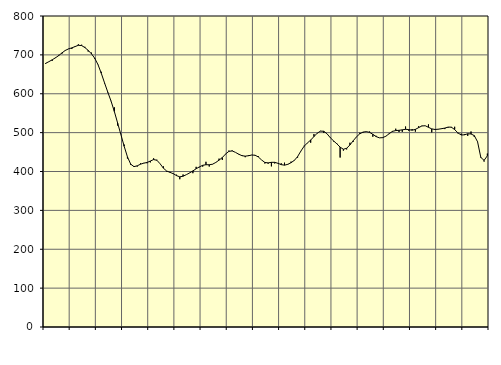
| Category | Piggar | Series 1 |
|---|---|---|
| nan | 676.5 | 678.28 |
| 87.0 | 682.6 | 682.55 |
| 87.0 | 684.5 | 687.34 |
| 87.0 | 693.2 | 692.38 |
| nan | 700 | 698.29 |
| 88.0 | 703.2 | 705.12 |
| 88.0 | 712.2 | 711.39 |
| 88.0 | 715.8 | 715.38 |
| nan | 715.1 | 718.01 |
| 89.0 | 720.4 | 721.36 |
| 89.0 | 727.2 | 724.63 |
| 89.0 | 726.1 | 723.93 |
| nan | 720.7 | 718.84 |
| 90.0 | 708.6 | 711.55 |
| 90.0 | 705.8 | 702.76 |
| 90.0 | 689.7 | 691.4 |
| nan | 674.4 | 674.96 |
| 91.0 | 656.5 | 652.93 |
| 91.0 | 626.8 | 627.99 |
| 91.0 | 602.9 | 604.09 |
| nan | 581.6 | 580.92 |
| 92.0 | 565.1 | 554.32 |
| 92.0 | 518.2 | 524.76 |
| 92.0 | 495.4 | 494.89 |
| nan | 469.2 | 464.93 |
| 93.0 | 433.4 | 437.69 |
| 93.0 | 417 | 418.87 |
| 93.0 | 413.9 | 412.54 |
| nan | 412.8 | 414.64 |
| 94.0 | 421 | 418.78 |
| 94.0 | 422.1 | 421.48 |
| 94.0 | 421.3 | 423.17 |
| nan | 423.4 | 426.89 |
| 95.0 | 434 | 430.69 |
| 95.0 | 430.2 | 428.92 |
| 95.0 | 419.7 | 419.66 |
| nan | 413.2 | 408.42 |
| 96.0 | 399.6 | 401.2 |
| 96.0 | 399.1 | 397.86 |
| 96.0 | 395.3 | 394.38 |
| nan | 391.8 | 389.39 |
| 97.0 | 380.1 | 386.26 |
| 97.0 | 392.3 | 387.85 |
| 97.0 | 391.9 | 391.85 |
| nan | 396.7 | 396.26 |
| 98.0 | 395.6 | 401.49 |
| 98.0 | 412 | 407.04 |
| 98.0 | 410.9 | 411.87 |
| nan | 412.5 | 415.94 |
| 99.0 | 425 | 417.44 |
| 99.0 | 412.8 | 417.34 |
| 99.0 | 418.3 | 418.71 |
| nan | 423.7 | 423.25 |
| 0.0 | 433.1 | 429.2 |
| 0.0 | 429.7 | 435.94 |
| 0.0 | 445.4 | 444.9 |
| nan | 453.8 | 451.82 |
| 1.0 | 454.3 | 452.9 |
| 1.0 | 449.3 | 449.28 |
| 1.0 | 445.2 | 444.47 |
| nan | 442.4 | 440.71 |
| 2.0 | 436.8 | 439.48 |
| 2.0 | 442 | 440.57 |
| 2.0 | 442.7 | 442.35 |
| nan | 441 | 441.94 |
| 3.0 | 439.3 | 437.41 |
| 3.0 | 429.6 | 429.63 |
| 3.0 | 420.5 | 423.29 |
| nan | 420 | 422.21 |
| 4.0 | 413.2 | 423.62 |
| 4.0 | 420.7 | 423.6 |
| 4.0 | 421.7 | 421.1 |
| nan | 421.1 | 417.67 |
| 5.0 | 422.7 | 416.27 |
| 5.0 | 419.3 | 418.42 |
| 5.0 | 425.4 | 422.7 |
| nan | 427.7 | 428.56 |
| 6.0 | 435.7 | 438.34 |
| 6.0 | 452.7 | 452.38 |
| 6.0 | 466.3 | 465.09 |
| nan | 472.8 | 473.36 |
| 7.0 | 474.1 | 480.87 |
| 7.0 | 496.2 | 489.81 |
| 7.0 | 498 | 498.53 |
| nan | 504.5 | 503.89 |
| 8.0 | 499 | 503.53 |
| 8.0 | 496.9 | 496.95 |
| 8.0 | 486.1 | 486.93 |
| nan | 477.3 | 478.76 |
| 9.0 | 472.4 | 471.25 |
| 9.0 | 435.9 | 462.7 |
| 9.0 | 453.7 | 457.27 |
| nan | 456.8 | 459.71 |
| 10.0 | 474 | 468.36 |
| 10.0 | 476.4 | 479.08 |
| 10.0 | 488.7 | 489.11 |
| nan | 499.6 | 496.95 |
| 11.0 | 500 | 501.43 |
| 11.0 | 502.9 | 502.51 |
| 11.0 | 502.8 | 500.72 |
| nan | 489.4 | 495.68 |
| 12.0 | 491.8 | 489.84 |
| 12.0 | 486.4 | 486.56 |
| 12.0 | 486.3 | 487.07 |
| nan | 490.7 | 490.83 |
| 13.0 | 496.3 | 497.35 |
| 13.0 | 502 | 503.26 |
| 13.0 | 510.1 | 505.28 |
| nan | 501.4 | 505.95 |
| 14.0 | 502 | 507.22 |
| 14.0 | 515.7 | 508.55 |
| 14.0 | 504.5 | 507.76 |
| nan | 509.3 | 506.2 |
| 15.0 | 502.5 | 508.33 |
| 15.0 | 516.4 | 512.94 |
| 15.0 | 517.8 | 517.13 |
| nan | 517.6 | 517.72 |
| 16.0 | 521.2 | 513.7 |
| 16.0 | 500.6 | 509.64 |
| 16.0 | 507 | 508.1 |
| nan | 509.4 | 508.77 |
| 17.0 | 509.3 | 510.11 |
| 17.0 | 509.1 | 511.64 |
| 17.0 | 512.7 | 514.2 |
| nan | 512.8 | 514.04 |
| 18.0 | 515.1 | 507.81 |
| 18.0 | 498 | 499.38 |
| 18.0 | 497.4 | 493.92 |
| nan | 496.2 | 494.35 |
| 19.0 | 491.6 | 497.08 |
| 19.0 | 502.9 | 496.51 |
| 19.0 | 488.8 | 492.4 |
| nan | 477.3 | 476.56 |
| 20.0 | 434.9 | 436.24 |
| 20.0 | 425.5 | 428.62 |
| 20.0 | 446.1 | 440.43 |